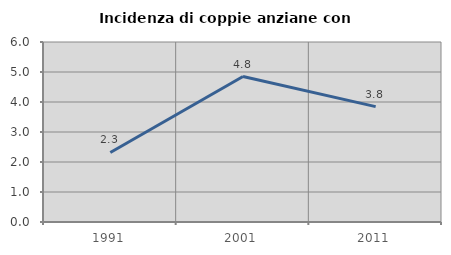
| Category | Incidenza di coppie anziane con figli |
|---|---|
| 1991.0 | 2.319 |
| 2001.0 | 4.848 |
| 2011.0 | 3.846 |